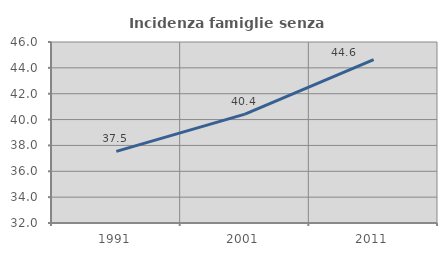
| Category | Incidenza famiglie senza nuclei |
|---|---|
| 1991.0 | 37.538 |
| 2001.0 | 40.419 |
| 2011.0 | 44.633 |